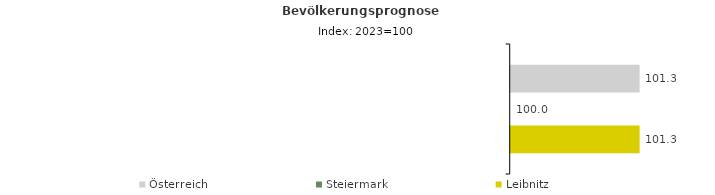
| Category | Österreich | Steiermark | Leibnitz |
|---|---|---|---|
| 2023.0 | 101.3 | 100 | 101.3 |